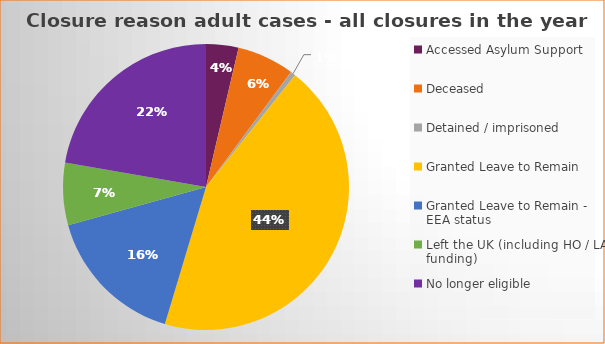
| Category | Total | Percentage |
|---|---|---|
| Accessed Asylum Support | 13 | 0.04 |
| Deceased | 23 | 0.06 |
| Detained / imprisoned | 2 | 0.01 |
| Granted Leave to Remain | 156 | 0.44 |
| Granted Leave to Remain - EEA status | 57 | 0.16 |
| Left the UK (including HO / LA funding)  | 25 | 0.07 |
| No longer eligible | 79 | 0.22 |